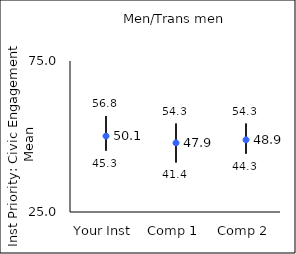
| Category | 25th percentile | 75th percentile | Mean |
|---|---|---|---|
| Your Inst | 45.3 | 56.8 | 50.13 |
| Comp 1 | 41.4 | 54.3 | 47.9 |
| Comp 2 | 44.3 | 54.3 | 48.9 |